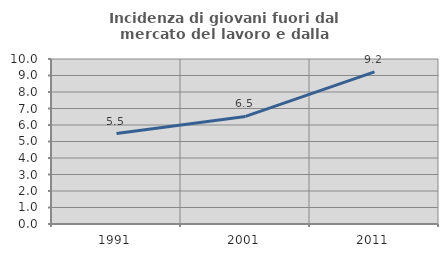
| Category | Incidenza di giovani fuori dal mercato del lavoro e dalla formazione  |
|---|---|
| 1991.0 | 5.479 |
| 2001.0 | 6.522 |
| 2011.0 | 9.221 |